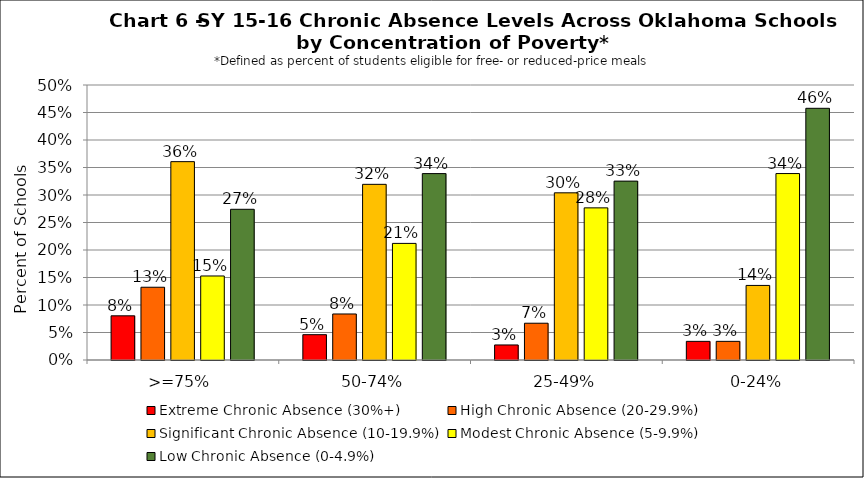
| Category | Extreme Chronic Absence (30%+) | High Chronic Absence (20-29.9%) | Significant Chronic Absence (10-19.9%) | Modest Chronic Absence (5-9.9%) | Low Chronic Absence (0-4.9%) |
|---|---|---|---|---|---|
| 0 | 0.08 | 0.132 | 0.361 | 0.153 | 0.274 |
| 1 | 0.046 | 0.084 | 0.319 | 0.212 | 0.339 |
| 2 | 0.027 | 0.067 | 0.304 | 0.277 | 0.325 |
| 3 | 0.034 | 0.034 | 0.136 | 0.339 | 0.458 |